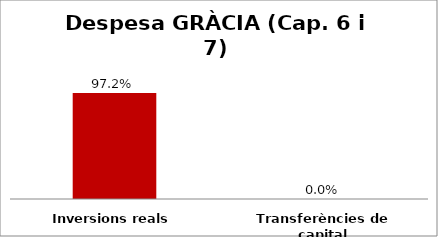
| Category | Series 0 |
|---|---|
| Inversions reals | 0.972 |
| Transferències de capital | 0 |